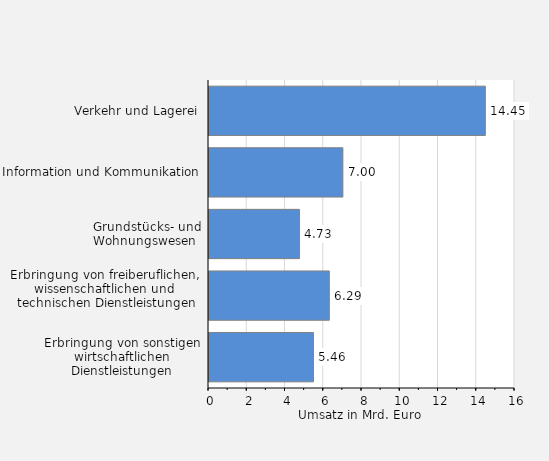
| Category | Umsatz in Mrd. Euro |
|---|---|
| Verkehr und Lagerei | 14.448 |
| Information und Kommunikation | 7 |
| Grundstücks- und Wohnungswesen  | 4.728 |
| Erbringung von freiberuflichen, 
wissenschaftlichen und 
technischen Dienstleistungen | 6.291 |
| Erbringung von sonstigen wirtschaftlichen Dienstleistungen | 5.461 |